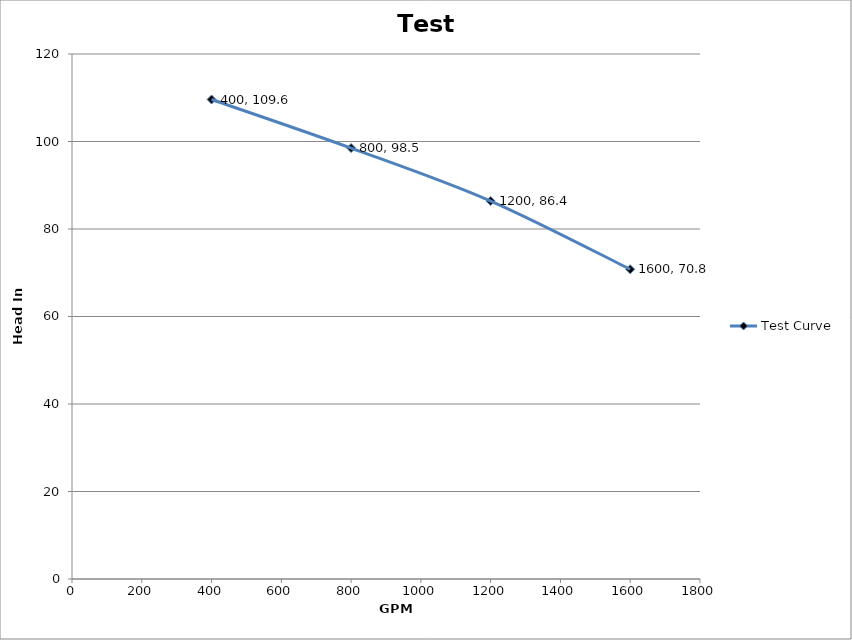
| Category | Test Curve |
|---|---|
| 400.0 | 109.6 |
| 800.0 | 98.5 |
| 1200.0 | 86.399 |
| 1600.0 | 70.798 |